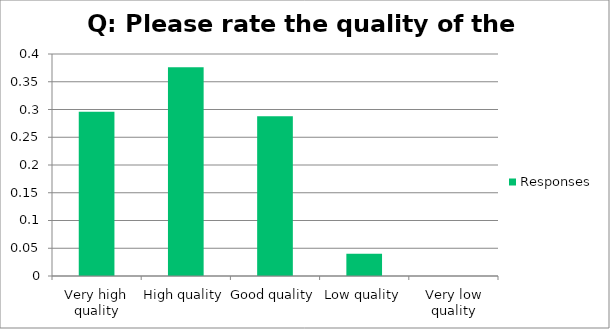
| Category | Responses |
|---|---|
| Very high quality | 0.296 |
| High quality | 0.376 |
| Good quality | 0.288 |
| Low quality | 0.04 |
| Very low quality | 0 |